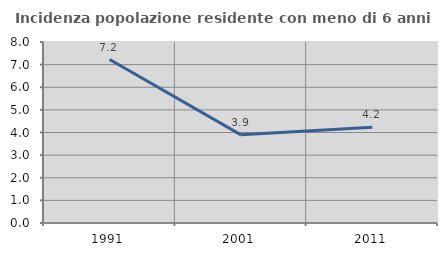
| Category | Incidenza popolazione residente con meno di 6 anni |
|---|---|
| 1991.0 | 7.226 |
| 2001.0 | 3.897 |
| 2011.0 | 4.236 |